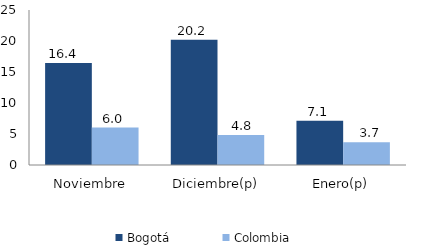
| Category | Bogotá | Colombia |
|---|---|---|
| Noviembre | 16.447 | 6.046 |
| Diciembre(p) | 20.185 | 4.841 |
| Enero(p) | 7.121 | 3.65 |